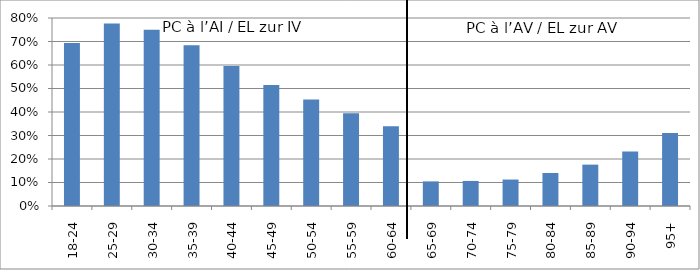
| Category | PC à l’AI / EL zur IV PC à l’AV / EL zur AV |
|---|---|
| 18-24 | 0.693 |
| 25-29 | 0.777 |
| 30-34 | 0.75 |
| 35-39 | 0.684 |
| 40-44 | 0.596 |
| 45-49 | 0.515 |
| 50-54 | 0.454 |
| 55-59 | 0.395 |
| 60-64 | 0.34 |
| 65-69 | 0.105 |
| 70-74 | 0.107 |
| 75-79 | 0.113 |
| 80-84 | 0.14 |
| 85-89 | 0.176 |
| 90-94 | 0.232 |
| 95+ | 0.311 |